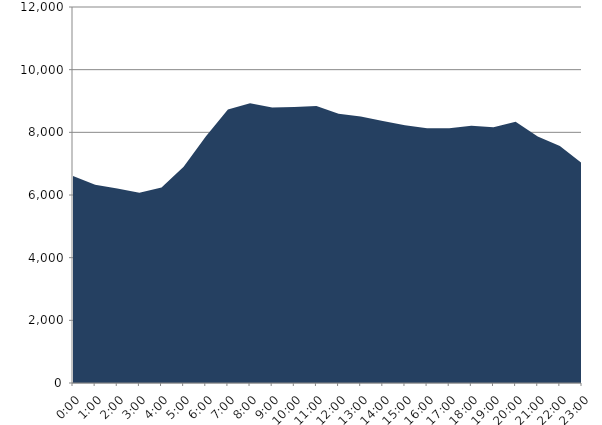
| Category | Series 0 | Series 1 |
|---|---|---|
| 2016-04-20 |  | 6604.22 |
| 2016-04-20 01:00:00 |  | 6329.617 |
| 2016-04-20 02:00:00 |  | 6204.936 |
| 2016-04-20 03:00:00 |  | 6068.369 |
| 2016-04-20 04:00:00 |  | 6238.935 |
| 2016-04-20 05:00:00 |  | 6899.519 |
| 2016-04-20 06:00:00 |  | 7863.885 |
| 2016-04-20 07:00:00 |  | 8725.5 |
| 2016-04-20 08:00:00 |  | 8924.255 |
| 2016-04-20 09:00:00 |  | 8792.978 |
| 2016-04-20 10:00:00 |  | 8806.735 |
| 2016-04-20 11:00:00 |  | 8841.912 |
| 2016-04-20 12:00:00 |  | 8590.276 |
| 2016-04-20 13:00:00 |  | 8504.256 |
| 2016-04-20 14:00:00 |  | 8361.254 |
| 2016-04-20 15:00:00 |  | 8227.969 |
| 2016-04-20 16:00:00 |  | 8133.122 |
| 2016-04-20 17:00:00 |  | 8128.12 |
| 2016-04-20 18:00:00 |  | 8210.09 |
| 2016-04-20 19:00:00 |  | 8161.668 |
| 2016-04-20 20:00:00 |  | 8339.702 |
| 2016-04-20 21:00:00 |  | 7870.286 |
| 2016-04-20 22:00:00 |  | 7563.706 |
| 2016-04-20 23:00:00 |  | 7014.754 |